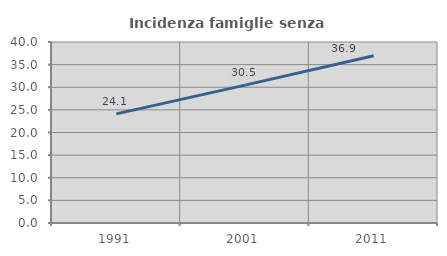
| Category | Incidenza famiglie senza nuclei |
|---|---|
| 1991.0 | 24.124 |
| 2001.0 | 30.468 |
| 2011.0 | 36.946 |